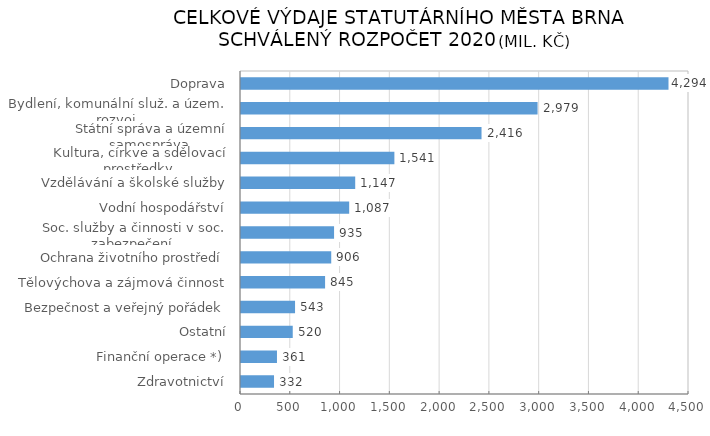
| Category | Series 0 |
|---|---|
|  Zdravotnictví | 331.729 |
|  Finanční operace *) | 361.352 |
|  Ostatní | 519.744 |
|  Bezpečnost a veřejný pořádek | 542.859 |
|  Tělovýchova a zájmová činnost | 844.597 |
|  Ochrana životního prostředí | 906.32 |
|  Soc. služby a činnosti v soc. zabezpečení | 934.787 |
|  Vodní hospodářství | 1086.709 |
|  Vzdělávání a školské služby | 1147.235 |
|  Kultura, církve a sdělovací prostředky | 1540.678 |
|  Státní správa a územní samospráva | 2416.031 |
|  Bydlení, komunální služ. a územ. rozvoj | 2979.016 |
|  Doprava | 4294.056 |